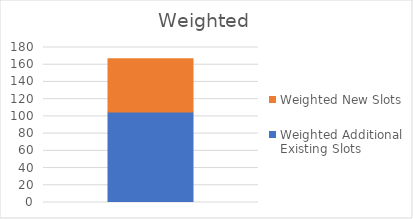
| Category | Weighted Additional Existing Slots | Weighted New Slots |
|---|---|---|
| Total | 105 | 62 |